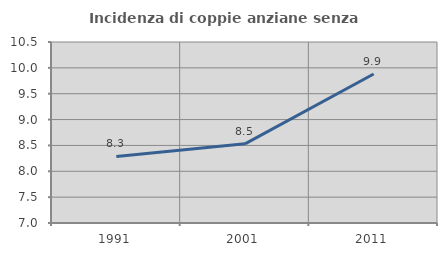
| Category | Incidenza di coppie anziane senza figli  |
|---|---|
| 1991.0 | 8.287 |
| 2001.0 | 8.531 |
| 2011.0 | 9.881 |